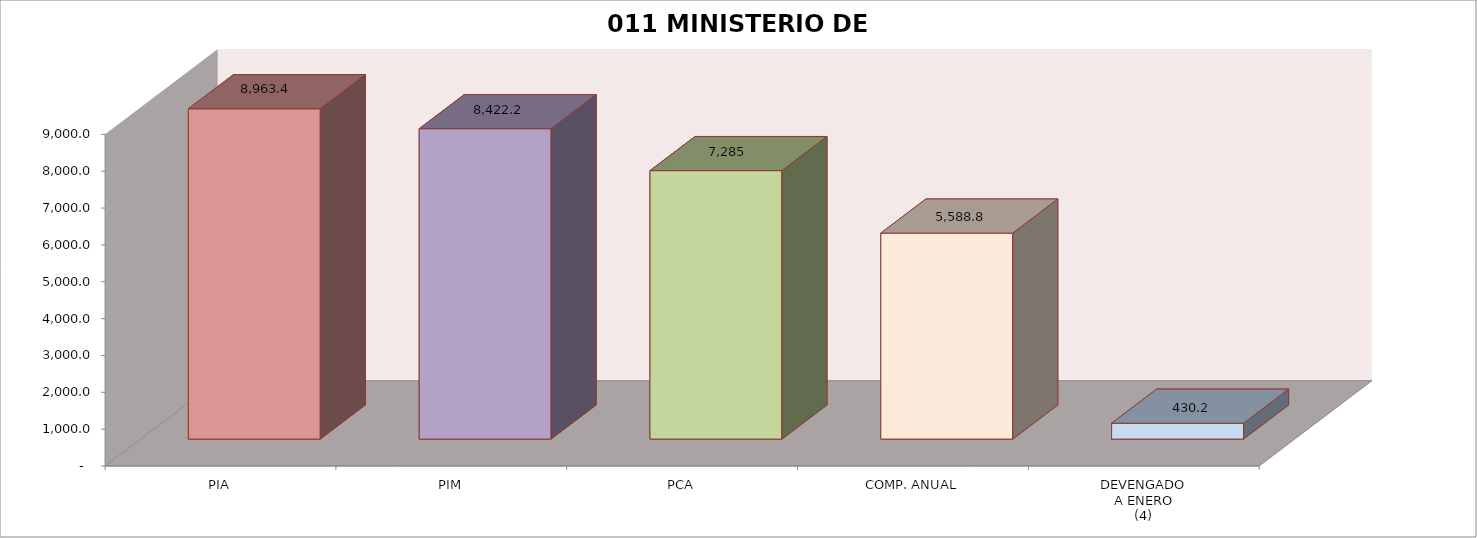
| Category | 011 MINISTERIO DE SALUD |
|---|---|
| PIA | 8963.39 |
| PIM | 8422.208 |
| PCA | 7284.659 |
| COMP. ANUAL | 5588.806 |
| DEVENGADO
A ENERO
(4) | 430.17 |